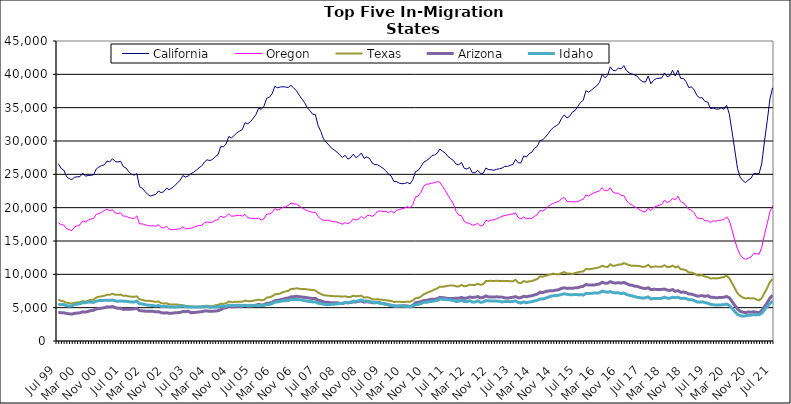
| Category | California | Oregon | Texas | Arizona | Idaho |
|---|---|---|---|---|---|
| Jul 99 | 26605 | 17749 | 6209 | 4339 | 5471 |
| Aug 99 | 25882 | 17447 | 6022 | 4228 | 5444 |
| Sep 99 | 25644 | 17401 | 5941 | 4237 | 5488 |
| Oct 99 | 24669 | 16875 | 5751 | 4134 | 5279 |
| Nov 99 | 24353 | 16701 | 5680 | 4073 | 5260 |
| Dec 99 | 24218 | 16570 | 5619 | 4042 | 5269 |
| Jan 00 | 24574 | 17109 | 5736 | 4142 | 5485 |
| Feb 00 | 24620 | 17295 | 5789 | 4192 | 5530 |
| Mar 00 | 24655 | 17436 | 5826 | 4226 | 5590 |
| Apr 00 | 25195 | 18009 | 5980 | 4375 | 5748 |
| May 00 | 24730 | 17875 | 5897 | 4337 | 5729 |
| Jun 00 | 24825 | 18113 | 6070 | 4444 | 5853 |
| Jul 00 | 24857 | 18294 | 6163 | 4555 | 5824 |
| Aug 00 | 24913 | 18376 | 6199 | 4603 | 5788 |
| Sep 00 | 25792 | 18971 | 6529 | 4804 | 5976 |
| Oct 00 | 26106 | 19135 | 6643 | 4870 | 6058 |
| Nov 00 | 26315 | 19306 | 6705 | 4926 | 6085 |
| Dec 00 | 26415 | 19570 | 6793 | 4991 | 6096 |
| Jan 01 | 26995 | 19781 | 6942 | 5122 | 6119 |
| Feb 01 | 26851 | 19519 | 6948 | 5089 | 6090 |
| Mar 01 | 27352 | 19720 | 7080 | 5180 | 6143 |
| Apr 01 | 26918 | 19221 | 6943 | 5020 | 6020 |
| May 01 | 26848 | 19126 | 6924 | 4899 | 5950 |
| Jun 01 | 26974 | 19241 | 6959 | 4895 | 6019 |
| Jul 01 | 26172 | 18725 | 6778 | 4737 | 5951 |
| Aug 01 | 25943 | 18736 | 6810 | 4757 | 5973 |
| Sep 01 | 25399 | 18514 | 6688 | 4753 | 5895 |
| Oct 01 | 25050 | 18415 | 6650 | 4780 | 5833 |
| Nov 01 | 24873 | 18381 | 6631 | 4826 | 5850 |
| Dec 01 | 25099 | 18765 | 6708 | 4898 | 5969 |
| Jan 02 | 23158 | 17561 | 6261 | 4560 | 5595 |
| Feb 02 | 22926 | 17573 | 6162 | 4531 | 5560 |
| Mar 02 | 22433 | 17452 | 6052 | 4481 | 5458 |
| Apr 02 | 22012 | 17314 | 6046 | 4458 | 5380 |
| May 02 | 21733 | 17267 | 6007 | 4452 | 5358 |
| Jun 02 | 21876 | 17298 | 5933 | 4444 | 5315 |
| Jul 02 | 21997 | 17209 | 5873 | 4383 | 5243 |
| Aug 02 | 22507 | 17436 | 5929 | 4407 | 5315 |
| Sep 02 | 22244 | 17010 | 5672 | 4248 | 5192 |
| Oct 02 | 22406 | 16952 | 5625 | 4191 | 5167 |
| Nov 02 | 22922 | 17223 | 5663 | 4242 | 5221 |
| Dec 02 | 22693 | 16770 | 5499 | 4142 | 5120 |
| Jan 03 | 22964 | 16694 | 5463 | 4166 | 5089 |
| Feb 03 | 23276 | 16727 | 5461 | 4226 | 5077 |
| Mar 03 | 23736 | 16766 | 5486 | 4251 | 5145 |
| Apr 03 | 24079 | 16859 | 5389 | 4289 | 5145 |
| May 03 | 24821 | 17117 | 5378 | 4415 | 5254 |
| Jun 03 | 24592 | 16812 | 5273 | 4426 | 5135 |
| Jul 03 | 24754 | 16875 | 5226 | 4466 | 5124 |
| Aug 03 | 25092 | 16922 | 5181 | 4244 | 5100 |
| Sep 03 | 25316 | 17036 | 5181 | 4279 | 5086 |
| Oct 03 | 25622 | 17228 | 5139 | 4301 | 5110 |
| Nov 03 | 25984 | 17335 | 5175 | 4362 | 5091 |
| Dec 03 | 26269 | 17350 | 5189 | 4396 | 5113 |
| Jan 04 | 26852 | 17734 | 5255 | 4492 | 5152 |
| Feb 04 | 27184 | 17860 | 5301 | 4502 | 5183 |
| Mar 04 | 27062 | 17757 | 5227 | 4443 | 5056 |
| Apr 04 | 27238 | 17840 | 5227 | 4461 | 5104 |
| May 04 | 27671 | 18113 | 5345 | 4493 | 5095 |
| Jun 04 | 27949 | 18201 | 5416 | 4532 | 5103 |
| Jul 04 | 29172 | 18727 | 5597 | 4697 | 5231 |
| Aug 04 | 29122 | 18529 | 5561 | 4945 | 5197 |
| Sep 04 | 29542 | 18678 | 5656 | 4976 | 5237 |
| Oct 04 | 30674 | 19108 | 5922 | 5188 | 5363 |
| Nov 04 | 30472 | 18716 | 5823 | 5106 | 5321 |
| Dec 04 | 30831 | 18755 | 5838 | 5135 | 5312 |
| Jan 05 | 31224 | 18823 | 5906 | 5155 | 5374 |
| Feb 05 | 31495 | 18842 | 5898 | 5168 | 5357 |
| Mar 05 | 31714 | 18738 | 5894 | 5212 | 5313 |
| Apr 05 | 32750 | 18998 | 6060 | 5340 | 5350 |
| May 05 | 32575 | 18504 | 5989 | 5269 | 5276 |
| Jun 05 | 32898 | 18414 | 5954 | 5252 | 5271 |
| Jul 05 | 33384 | 18395 | 6062 | 5322 | 5322 |
| Aug 05 | 33964 | 18381 | 6113 | 5375 | 5316 |
| Sep 05 | 34897 | 18426 | 6206 | 5493 | 5362 |
| Oct 05 | 34780 | 18132 | 6100 | 5408 | 5308 |
| Nov 05 | 35223 | 18332 | 6162 | 5434 | 5314 |
| Dec 05 | 36415 | 19047 | 6508 | 5658 | 5487 |
| Jan 06 | 36567 | 19032 | 6576 | 5688 | 5480 |
| Feb 06 | 37074 | 19257 | 6692 | 5792 | 5616 |
| Mar 06 | 38207 | 19845 | 6993 | 6052 | 5850 |
| Apr 06 | 37976 | 19637 | 7024 | 6101 | 5864 |
| May 06 | 38099 | 19781 | 7114 | 6178 | 5943 |
| Jun 06 | 38141 | 20061 | 7331 | 6276 | 6018 |
| Jul 06 | 38097 | 20111 | 7431 | 6399 | 6046 |
| Aug 06 | 38021 | 20333 | 7542 | 6450 | 6064 |
| Sep 06 | 38349 | 20686 | 7798 | 6627 | 6232 |
| Oct 06 | 37947 | 20591 | 7825 | 6647 | 6216 |
| Nov 06 | 37565 | 20526 | 7907 | 6707 | 6244 |
| Dec 06 | 36884 | 20272 | 7840 | 6648 | 6192 |
| Jan 07 | 36321 | 19984 | 7789 | 6597 | 6151 |
| Feb 07 | 35752 | 19752 | 7799 | 6554 | 6048 |
| Mar 07 | 35025 | 19547 | 7737 | 6487 | 5989 |
| Apr 07 | 34534 | 19412 | 7685 | 6430 | 5937 |
| May 07 | 34022 | 19296 | 7654 | 6353 | 5858 |
| Jun 07 | 33974 | 19318 | 7577 | 6390 | 5886 |
| Jul 07 | 32298 | 18677 | 7250 | 6117 | 5682 |
| Aug 07 | 31436 | 18322 | 7070 | 6034 | 5617 |
| Sep 07 | 30331 | 18087 | 6853 | 5847 | 5500 |
| Oct 07 | 29813 | 18108 | 6839 | 5821 | 5489 |
| Nov 07 | 29384 | 18105 | 6777 | 5769 | 5481 |
| Dec 07 | 28923 | 17949 | 6760 | 5733 | 5499 |
| Jan 08 | 28627 | 17890 | 6721 | 5732 | 5521 |
| Feb 08 | 28328 | 17834 | 6719 | 5749 | 5579 |
| Mar 08 | 27911 | 17680 | 6690 | 5650 | 5614 |
| Apr 08 | 27543 | 17512 | 6656 | 5612 | 5635 |
| May 08 | 27856 | 17754 | 6705 | 5774 | 5798 |
| Jun 08 | 27287 | 17589 | 6593 | 5717 | 5745 |
| Jul 08 | 27495 | 17834 | 6623 | 5761 | 5807 |
| Aug 08 | 28018 | 18309 | 6789 | 5867 | 5982 |
| Sep-08 | 27491 | 18164 | 6708 | 5864 | 5954 |
| Oct 08 | 27771 | 18291 | 6755 | 5942 | 6032 |
| Nov 08 | 28206 | 18706 | 6787 | 5970 | 6150 |
| Dec 08 | 27408 | 18353 | 6505 | 5832 | 5975 |
| Jan 09 | 27601 | 18778 | 6569 | 5890 | 5995 |
| Feb 09 | 27394 | 18863 | 6483 | 5845 | 5936 |
| Mar 09 | 26690 | 18694 | 6273 | 5751 | 5806 |
| Apr 09 | 26461 | 18943 | 6222 | 5735 | 5777 |
| May 09 | 26435 | 19470 | 6272 | 5819 | 5767 |
| Jun 09 | 26187 | 19522 | 6199 | 5700 | 5649 |
| Jul 09 | 25906 | 19408 | 6171 | 5603 | 5617 |
| Aug 09 | 25525 | 19469 | 6128 | 5533 | 5540 |
| Sep 09 | 25050 | 19249 | 6059 | 5405 | 5437 |
| Oct 09 | 24741 | 19529 | 6004 | 5349 | 5369 |
| Nov 09 | 23928 | 19187 | 5854 | 5271 | 5248 |
| Dec 09 | 23899 | 19607 | 5886 | 5261 | 5195 |
| Jan 10 | 23676 | 19703 | 5881 | 5232 | 5234 |
| Feb 10 | 23592 | 19845 | 5850 | 5272 | 5236 |
| Mar 10 | 23634 | 19946 | 5864 | 5278 | 5219 |
| Apr 10 | 23774 | 20134 | 5889 | 5257 | 5201 |
| May 10 | 23567 | 19966 | 5897 | 5172 | 5105 |
| Jun 10 | 24166 | 20464 | 6087 | 5356 | 5237 |
| Jul 10 | 25410 | 21627 | 6417 | 5742 | 5452 |
| Aug 10 | 25586 | 21744 | 6465 | 5797 | 5491 |
| Sep 10 | 26150 | 22314 | 6667 | 5907 | 5609 |
| Oct 10 | 26807 | 23219 | 6986 | 6070 | 5831 |
| Nov 10 | 27033 | 23520 | 7179 | 6100 | 5810 |
| Dec 10 | 27332 | 23551 | 7361 | 6182 | 5898 |
| Jan 11 | 27769 | 23697 | 7525 | 6276 | 5938 |
| Feb 11 | 27898 | 23718 | 7708 | 6267 | 6016 |
| Mar 11 | 28155 | 23921 | 7890 | 6330 | 6081 |
| Apr 11 | 28790 | 23847 | 8146 | 6544 | 6305 |
| May 11 | 28471 | 23215 | 8131 | 6502 | 6248 |
| Jun 11 | 28191 | 22580 | 8199 | 6445 | 6217 |
| Jul 11 | 27678 | 21867 | 8291 | 6368 | 6202 |
| Aug 11 | 27372 | 21203 | 8321 | 6356 | 6146 |
| Sep 11 | 27082 | 20570 | 8341 | 6387 | 6075 |
| Oct 11 | 26528 | 19442 | 8191 | 6402 | 5932 |
| Nov 11 | 26440 | 18872 | 8176 | 6426 | 5968 |
| Dec 11 | 26770 | 18784 | 8401 | 6533 | 6106 |
| Jan 12 | 25901 | 17963 | 8202 | 6390 | 5933 |
| Feb 12 | 25796 | 17718 | 8266 | 6456 | 5900 |
| Mar 12 | 26042 | 17647 | 8456 | 6600 | 6054 |
| Apr 12 | 25239 | 17386 | 8388 | 6534 | 5838 |
| May 12 | 25238 | 17407 | 8401 | 6558 | 5854 |
| Jun 12 | 25593 | 17673 | 8594 | 6669 | 6009 |
| Jul 12 | 25155 | 17237 | 8432 | 6474 | 5817 |
| Aug 12 | 25146 | 17391 | 8536 | 6539 | 5842 |
| Sep 12 | 25942 | 18102 | 8989 | 6759 | 6061 |
| Oct 12 | 25718 | 17953 | 9012 | 6618 | 6027 |
| Nov 12 | 25677 | 18134 | 9032 | 6611 | 6009 |
| Dec 12 | 25619 | 18166 | 8981 | 6601 | 5999 |
| Jan 13 | 25757 | 18344 | 9051 | 6627 | 5989 |
| Feb-13 | 25830 | 18512 | 9001 | 6606 | 5968 |
| Mar-13 | 25940 | 18689 | 9021 | 6577 | 5853 |
| Apr 13 | 26187 | 18844 | 9013 | 6478 | 5925 |
| May 13 | 26192 | 18884 | 9003 | 6431 | 5924 |
| Jun-13 | 26362 | 19013 | 8948 | 6508 | 5896 |
| Jul 13 | 26467 | 19037 | 8958 | 6559 | 5948 |
| Aug 13 | 27253 | 19198 | 9174 | 6655 | 6020 |
| Sep 13 | 26711 | 18501 | 8747 | 6489 | 5775 |
| Oct 13 | 26733 | 18301 | 8681 | 6511 | 5711 |
| Nov 13 | 27767 | 18620 | 8989 | 6709 | 5860 |
| Dec 13 | 27583 | 18320 | 8863 | 6637 | 5740 |
| Jan 14 | 28107 | 18409 | 8939 | 6735 | 5843 |
| Feb-14 | 28313 | 18383 | 8989 | 6779 | 5893 |
| Mar 14 | 28934 | 18696 | 9160 | 6918 | 6015 |
| Apr 14 | 29192 | 18946 | 9291 | 7036 | 6099 |
| May 14 | 30069 | 19603 | 9701 | 7314 | 6304 |
| Jun 14 | 30163 | 19487 | 9641 | 7252 | 6293 |
| Jul-14 | 30587 | 19754 | 9752 | 7415 | 6427 |
| Aug-14 | 31074 | 20201 | 9882 | 7499 | 6557 |
| Sep 14 | 31656 | 20459 | 9997 | 7536 | 6719 |
| Oct 14 | 32037 | 20663 | 10109 | 7555 | 6786 |
| Nov 14 | 32278 | 20825 | 9992 | 7628 | 6831 |
| Dec 14 | 32578 | 20918 | 10006 | 7705 | 6860 |
| Jan 15 | 33414 | 21396 | 10213 | 7906 | 7000 |
| Feb 15 | 33922 | 21518 | 10337 | 7982 | 7083 |
| Mar 15 | 33447 | 20942 | 10122 | 7891 | 7006 |
| Apr-15 | 33731 | 20893 | 10138 | 7906 | 6931 |
| May 15 | 34343 | 20902 | 10053 | 7895 | 6952 |
| Jun-15 | 34572 | 20870 | 10192 | 7973 | 6966 |
| Jul 15 | 35185 | 20916 | 10303 | 8000 | 6949 |
| Aug 15 | 35780 | 21115 | 10399 | 8126 | 6938 |
| Sep 15 | 36109 | 21246 | 10428 | 8207 | 6896 |
| Oct 15 | 37555 | 21908 | 10813 | 8477 | 7140 |
| Nov 15 | 37319 | 21750 | 10763 | 8390 | 7112 |
| Dec 15 | 37624 | 21990 | 10807 | 8395 | 7149 |
| Jan 16 | 37978 | 22248 | 10892 | 8388 | 7201 |
| Feb 16 | 38285 | 22369 | 10951 | 8508 | 7192 |
| Mar 16 | 38792 | 22506 | 11075 | 8547 | 7226 |
| Apr 16 | 39994 | 22999 | 11286 | 8815 | 7487 |
| May 16 | 39488 | 22548 | 11132 | 8673 | 7382 |
| Jun 16 | 39864 | 22556 | 11100 | 8682 | 7315 |
| Jul 16 | 41123 | 22989 | 11516 | 8903 | 7420 |
| Aug 16 | 40573 | 22333 | 11251 | 8731 | 7261 |
| Sep 16 | 40560 | 22162 | 11340 | 8692 | 7216 |
| Oct 16 | 40923 | 22172 | 11456 | 8742 | 7233 |
| Nov 16 | 40817 | 21818 | 11459 | 8685 | 7101 |
| Dec 16 | 41311 | 21815 | 11681 | 8783 | 7203 |
| Jan 17 | 40543 | 21029 | 11524 | 8609 | 6982 |
| Feb 17 | 40218 | 20613 | 11385 | 8416 | 6852 |
| Mar 17 | 40052 | 20425 | 11276 | 8354 | 6775 |
| Apr 17 | 39913 | 20147 | 11297 | 8218 | 6653 |
| May 17 | 39695 | 19910 | 11265 | 8196 | 6552 |
| Jun 17 | 39177 | 19650 | 11225 | 8034 | 6500 |
| Jul 17 | 38901 | 19419 | 11115 | 7923 | 6429 |
| Aug 17 | 38827 | 19389 | 11168 | 7867 | 6479 |
| Sep 17 | 39736 | 19936 | 11426 | 7991 | 6609 |
| Oct 17 | 38576 | 19547 | 11041 | 7708 | 6315 |
| Nov 17 | 39108 | 20013 | 11158 | 7746 | 6381 |
| Dec 17 | 39359 | 20202 | 11185 | 7743 | 6366 |
| Jan 18 | 39420 | 20362 | 11118 | 7736 | 6380 |
| Feb 18 | 39440 | 20476 | 11128 | 7741 | 6407 |
| Mar 18 | 40218 | 21106 | 11362 | 7789 | 6578 |
| Apr 18 | 39637 | 20788 | 11111 | 7642 | 6423 |
| May 18 | 39777 | 20933 | 11097 | 7591 | 6430 |
| Jun 18 | 40602 | 21381 | 11317 | 7721 | 6554 |
| Jul 18 | 39767 | 21189 | 11038 | 7445 | 6489 |
| Aug 18 | 40608 | 21729 | 11200 | 7560 | 6569 |
| Sep 18 | 39395 | 20916 | 10772 | 7318 | 6383 |
| Oct 18 | 39383 | 20724 | 10740 | 7344 | 6429 |
| Nov 18 | 38891 | 20265 | 10605 | 7255 | 6365 |
| Dec 18 | 38013 | 19741 | 10292 | 7069 | 6205 |
| Jan 19 | 38130 | 19643 | 10261 | 7032 | 6203 |
| Feb 19 | 37658 | 19237 | 10132 | 6892 | 6073 |
| Mar 19 | 36831 | 18492 | 9848 | 6766 | 5863 |
| Apr 19 | 36492 | 18349 | 9839 | 6763 | 5827 |
| May 19 | 36481 | 18407 | 9867 | 6809 | 5873 |
| Jun 19 | 35925 | 17998 | 9661 | 6698 | 5761 |
| Jul 19 | 35843 | 18049 | 9598 | 6800 | 5673 |
| Aug 19 | 34870 | 17785 | 9361 | 6577 | 5512 |
| Sep 19 | 34945 | 18038 | 9428 | 6547 | 5437 |
| Oct 19 | 34802 | 17977 | 9385 | 6483 | 5390 |
| Nov 19 | 34775 | 18072 | 9403 | 6511 | 5401 |
| Dec 19 | 34976 | 18140 | 9518 | 6521 | 5419 |
| Jan 20 | 34774 | 18209 | 9594 | 6561 | 5434 |
| Feb 20 | 35352 | 18632 | 9804 | 6682 | 5543 |
| Mar 20 | 34013 | 18041 | 9411 | 6464 | 5330 |
| Apr 20 | 31385 | 16629 | 8666 | 5922 | 4906 |
| May 20 | 28657 | 15123 | 7927 | 5355 | 4419 |
| Jun 20 | 25915 | 13817 | 7164 | 4815 | 3992 |
| Jul 20 | 24545 | 12926 | 6776 | 4457 | 3810 |
| Aug 20 | 24048 | 12443 | 6521 | 4326 | 3720 |
| Sep 20 | 23756 | 12258 | 6386 | 4266 | 3784 |
| Oct 20 | 24166 | 12429 | 6452 | 4347 | 3861 |
| Nov 20 | 24404 | 12597 | 6386 | 4324 | 3883 |
| Dec 20 | 25120 | 13122 | 6420 | 4394 | 3974 |
| Jan 21 | 25111 | 13080 | 6236 | 4304 | 3924 |
| Feb 21 | 25114 | 13015 | 6094 | 4260 | 3930 |
| Mar 21 | 26701 | 14096 | 6455 | 4567 | 4185 |
| Apr 21 | 29998 | 15978 | 7222 | 5164 | 4697 |
| May 21 | 33020 | 17641 | 7969 | 5748 | 5148 |
| Jun 21 | 36320 | 19369 | 8840 | 6450 | 5628 |
| Jul 21 | 37989 | 20320 | 9306 | 6877 | 5984 |